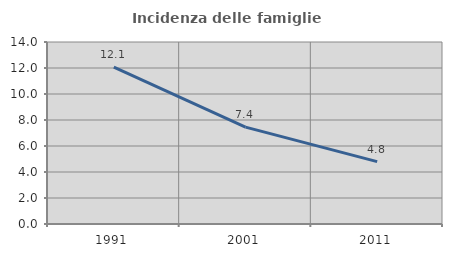
| Category | Incidenza delle famiglie numerose |
|---|---|
| 1991.0 | 12.065 |
| 2001.0 | 7.45 |
| 2011.0 | 4.797 |